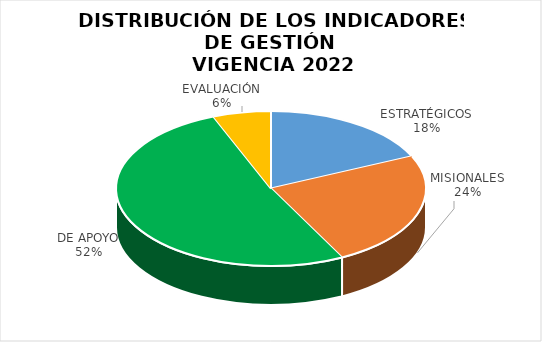
| Category | No. INDICADORES |
|---|---|
| ESTRATÉGICOS | 6 |
| MISIONALES | 8 |
| DE APOYO | 17 |
| EVALUACIÓN | 2 |